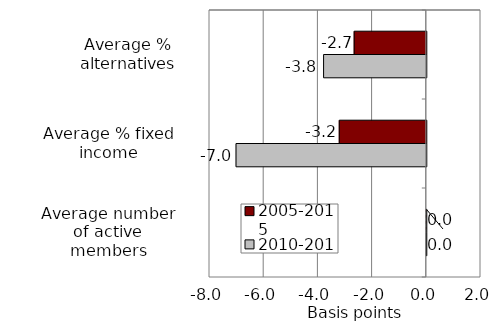
| Category | 2005-2015 | 2010-2015 |
|---|---|---|
| Average % alternatives | -2.661 | -3.79 |
| Average % fixed income | -3.212 | -7.021 |
| Average number of active members | 0 | 0 |